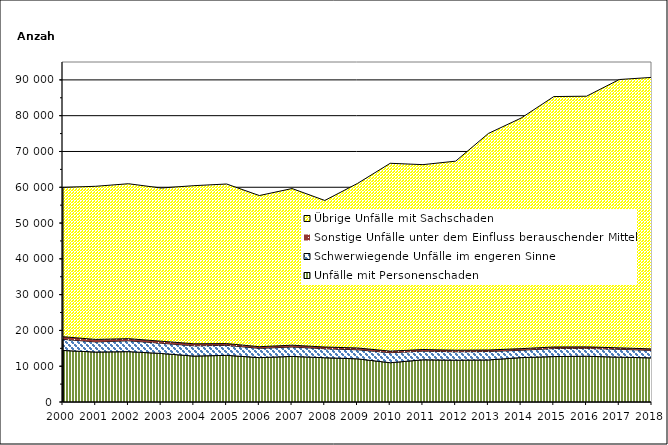
| Category | Unfälle mit Personenschaden | Schwerwiegende Unfälle im engeren Sinne | Sonstige Unfälle unter dem Einfluss berauschender Mittel 1) | Übrige Unfälle mit Sachschaden |
|---|---|---|---|---|
| 2000.0 | 14406 | 3105 | 725 | 41724 |
| 2001.0 | 13950 | 2845 | 688 | 42788 |
| 2002.0 | 14072 | 3028 | 595 | 43289 |
| 2003.0 | 13561 | 2866 | 559 | 42806 |
| 2004.0 | 12827 | 2877 | 564 | 44173 |
| 2005.0 | 13033 | 2795 | 499 | 44581 |
| 2006.0 | 12400 | 2588 | 466 | 42228 |
| 2007.0 | 12740 | 2628 | 507 | 43770 |
| 2008.0 | 12369 | 2510 | 481 | 40954 |
| 2009.0 | 12061 | 2528 | 502 | 45976 |
| 2010.0 | 10974 | 2803 | 441 | 52481 |
| 2011.0 | 11793 | 2419 | 443 | 51662 |
| 2012.0 | 11682 | 2353 | 422 | 52839 |
| 2013.0 | 11757 | 2357 | 414 | 60506 |
| 2014.0 | 12404 | 2056 | 448 | 64425 |
| 2015.0 | 12695 | 2249 | 427 | 69975 |
| 2016.0 | 12783 | 2187 | 433 | 70040 |
| 2017.0 | 12528 | 2214 | 385 | 74978 |
| 2018.0 | 12324 | 2084 | 421 | 75878 |